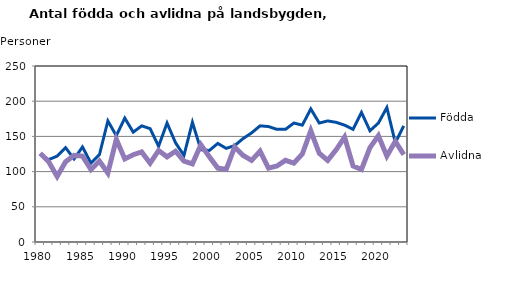
| Category | Födda | Avlidna |
|---|---|---|
| 1980.0 | 125 | 126 |
| 1981.0 | 117 | 114 |
| 1982.0 | 122 | 93 |
| 1983.0 | 134 | 114 |
| 1984.0 | 118 | 123 |
| 1985.0 | 135 | 122 |
| 1986.0 | 112 | 103 |
| 1987.0 | 124 | 115 |
| 1988.0 | 172 | 98 |
| 1989.0 | 151 | 146 |
| 1990.0 | 176 | 118 |
| 1991.0 | 156 | 124 |
| 1992.0 | 165 | 128 |
| 1993.0 | 161 | 112 |
| 1994.0 | 136 | 130 |
| 1995.0 | 169 | 121 |
| 1996.0 | 141 | 129 |
| 1997.0 | 123 | 115 |
| 1998.0 | 170 | 111 |
| 1999.0 | 131 | 138 |
| 2000.0 | 130 | 121 |
| 2001.0 | 140 | 105 |
| 2002.0 | 133 | 103 |
| 2003.0 | 137 | 135 |
| 2004.0 | 147 | 123 |
| 2005.0 | 155 | 116 |
| 2006.0 | 165 | 129 |
| 2007.0 | 164 | 105 |
| 2008.0 | 160 | 108 |
| 2009.0 | 160 | 116 |
| 2010.0 | 169 | 112 |
| 2011.0 | 166 | 125 |
| 2012.0 | 189 | 158 |
| 2013.0 | 169 | 126 |
| 2014.0 | 172 | 116 |
| 2015.0 | 170 | 131 |
| 2016.0 | 166 | 149 |
| 2017.0 | 160 | 108 |
| 2018.0 | 184 | 103 |
| 2019.0 | 158 | 134 |
| 2020.0 | 169 | 151 |
| 2021.0 | 191 | 122 |
| 2022.0 | 141 | 143 |
| 2023.0 | 165 | 124 |